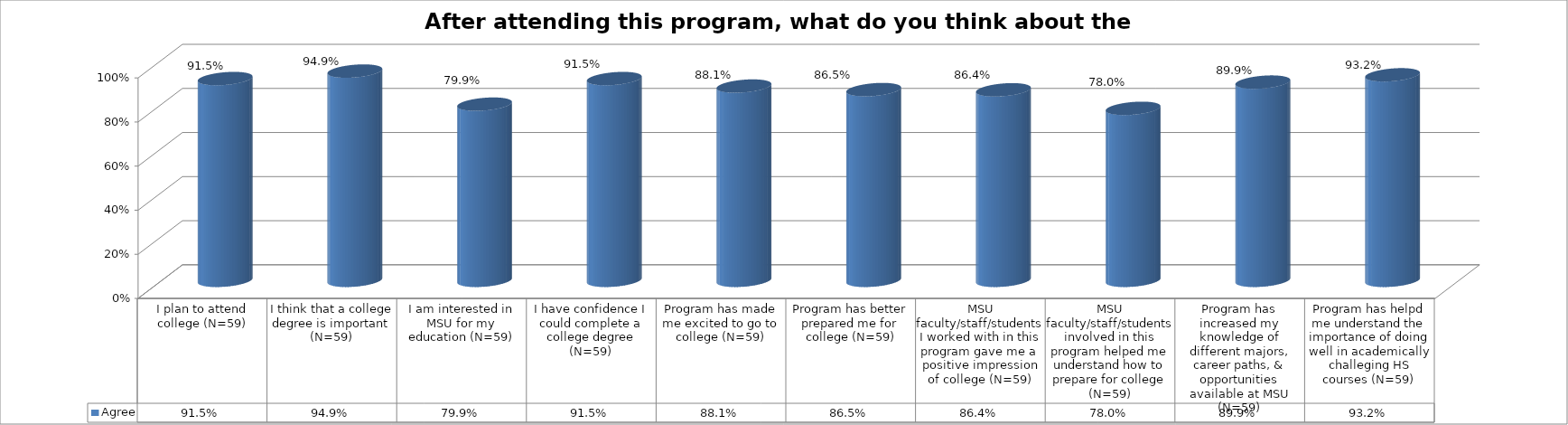
| Category | Agree |
|---|---|
| I plan to attend college (N=59) | 0.915 |
| I think that a college degree is important (N=59) | 0.949 |
| I am interested in MSU for my education (N=59) | 0.799 |
| I have confidence I could complete a college degree (N=59) | 0.915 |
| Program has made me excited to go to college (N=59) | 0.881 |
| Program has better prepared me for college (N=59) | 0.865 |
| MSU faculty/staff/students I worked with in this program gave me a positive impression of college (N=59) | 0.864 |
| MSU faculty/staff/students involved in this program helped me understand how to prepare for college (N=59) | 0.78 |
| Program has increased my knowledge of different majors, career paths, & opportunities available at MSU (N=59) | 0.899 |
| Program has helpd me understand the importance of doing well in academically challeging HS courses (N=59) | 0.932 |